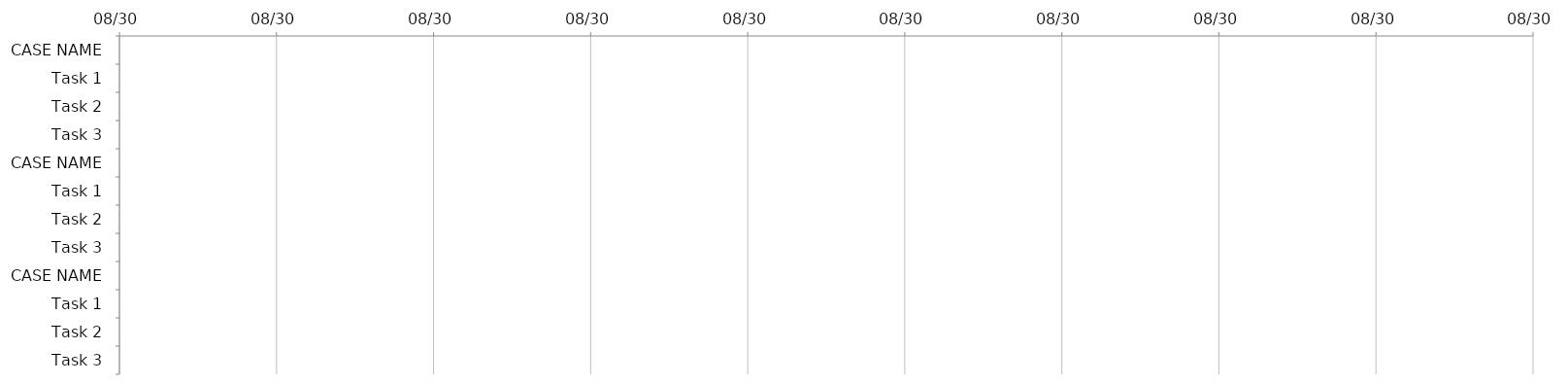
| Category | START | DAYS |
|---|---|---|
| CASE NAME |  | 0 |
| Task 1 |  | 0 |
| Task 2 |  | 0 |
| Task 3 |  | 0 |
| CASE NAME |  | 0 |
| Task 1 |  | 0 |
| Task 2 |  | 0 |
| Task 3 |  | 0 |
| CASE NAME |  | 0 |
| Task 1 |  | 0 |
| Task 2 |  | 0 |
| Task 3 |  | 0 |